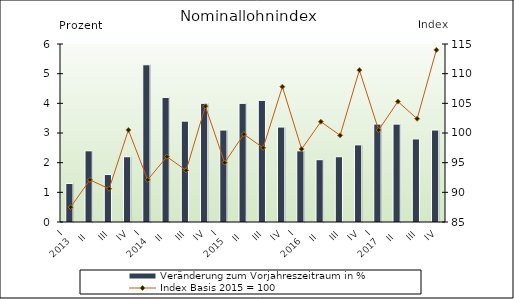
| Category | Veränderung zum Vorjahreszeitraum in % |
|---|---|
| 0 | 1.3 |
| 1 | 2.4 |
| 2 | 1.6 |
| 3 | 2.2 |
| 4 | 5.3 |
| 5 | 4.2 |
| 6 | 3.4 |
| 7 | 4 |
| 8 | 3.1 |
| 9 | 4 |
| 10 | 4.1 |
| 11 | 3.2 |
| 12 | 2.4 |
| 13 | 2.1 |
| 14 | 2.2 |
| 15 | 2.6 |
| 16 | 3.3 |
| 17 | 3.3 |
| 18 | 2.8 |
| 19 | 3.1 |